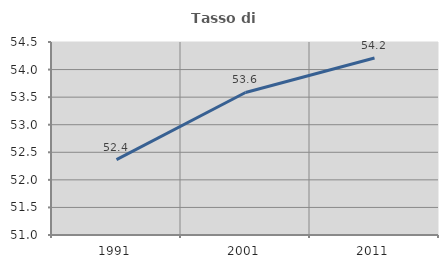
| Category | Tasso di occupazione   |
|---|---|
| 1991.0 | 52.366 |
| 2001.0 | 53.584 |
| 2011.0 | 54.211 |